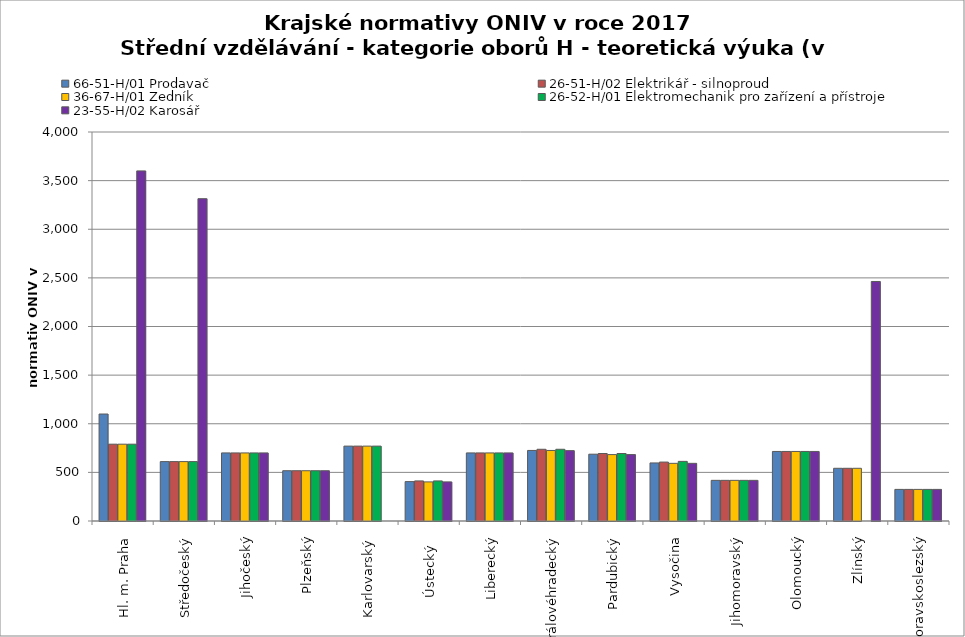
| Category | 66-51-H/01 Prodavač | 26-51-H/02 Elektrikář - silnoproud | 36-67-H/01 Zedník | 26-52-H/01 Elektromechanik pro zařízení a přístroje | 23-55-H/02 Karosář |
|---|---|---|---|---|---|
| Hl. m. Praha | 1100 | 790 | 790 | 790 | 3600 |
| Středočeský | 610.785 | 610.785 | 610.785 | 610.785 | 3314.126 |
| Jihočeský | 700 | 700 | 700 | 700 | 700 |
| Plzeňský | 517 | 517 | 517 | 517 | 517 |
| Karlovarský  | 770 | 770 | 770 | 770 | 0 |
| Ústecký   | 405 | 412 | 402 | 412 | 402 |
| Liberecký | 700 | 700 | 700 | 700 | 700 |
| Královéhradecký | 725.5 | 737.5 | 725.3 | 737.5 | 723.5 |
| Pardubický | 687 | 694 | 683 | 694 | 683 |
| Vysočina | 597 | 606 | 593 | 613 | 593 |
| Jihomoravský | 418 | 418 | 418 | 418 | 418 |
| Olomoucký | 715 | 715 | 715 | 715 | 715 |
| Zlínský | 542 | 542 | 542 | 0 | 2463 |
| Moravskoslezský | 325 | 325 | 325 | 325 | 325 |